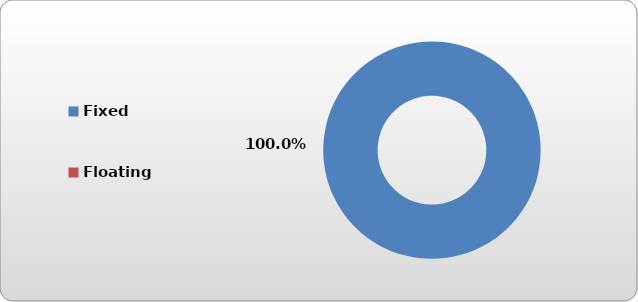
| Category | Fixed |
|---|---|
| Fixed | 435756.189 |
| Floating | 0 |